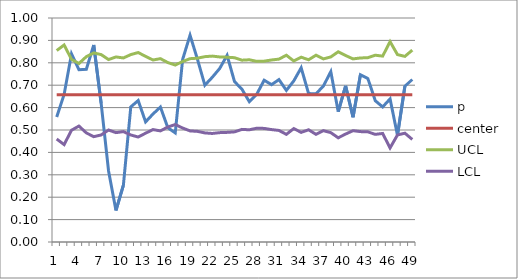
| Category | p | center | UCL | LCL |
|---|---|---|---|---|
| 0 | 0.558 | 0.657 | 0.855 | 0.46 |
| 1 | 0.659 | 0.657 | 0.88 | 0.435 |
| 2 | 0.84 | 0.657 | 0.815 | 0.499 |
| 3 | 0.769 | 0.657 | 0.797 | 0.518 |
| 4 | 0.771 | 0.657 | 0.827 | 0.487 |
| 5 | 0.879 | 0.657 | 0.844 | 0.47 |
| 6 | 0.619 | 0.657 | 0.837 | 0.478 |
| 7 | 0.317 | 0.657 | 0.814 | 0.5 |
| 8 | 0.141 | 0.657 | 0.826 | 0.488 |
| 9 | 0.253 | 0.657 | 0.822 | 0.493 |
| 10 | 0.603 | 0.657 | 0.837 | 0.478 |
| 11 | 0.632 | 0.657 | 0.846 | 0.469 |
| 12 | 0.536 | 0.657 | 0.829 | 0.486 |
| 13 | 0.571 | 0.657 | 0.813 | 0.502 |
| 14 | 0.603 | 0.657 | 0.818 | 0.496 |
| 15 | 0.51 | 0.657 | 0.801 | 0.513 |
| 16 | 0.487 | 0.657 | 0.79 | 0.524 |
| 17 | 0.815 | 0.657 | 0.806 | 0.509 |
| 18 | 0.923 | 0.657 | 0.818 | 0.496 |
| 19 | 0.816 | 0.657 | 0.821 | 0.494 |
| 20 | 0.7 | 0.657 | 0.827 | 0.487 |
| 21 | 0.735 | 0.657 | 0.83 | 0.485 |
| 22 | 0.775 | 0.657 | 0.826 | 0.488 |
| 23 | 0.833 | 0.657 | 0.825 | 0.489 |
| 24 | 0.716 | 0.657 | 0.823 | 0.492 |
| 25 | 0.682 | 0.657 | 0.812 | 0.503 |
| 26 | 0.627 | 0.657 | 0.814 | 0.501 |
| 27 | 0.659 | 0.657 | 0.806 | 0.508 |
| 28 | 0.722 | 0.657 | 0.807 | 0.507 |
| 29 | 0.702 | 0.657 | 0.813 | 0.502 |
| 30 | 0.725 | 0.657 | 0.816 | 0.498 |
| 31 | 0.677 | 0.657 | 0.834 | 0.481 |
| 32 | 0.719 | 0.657 | 0.808 | 0.506 |
| 33 | 0.778 | 0.657 | 0.825 | 0.489 |
| 34 | 0.663 | 0.657 | 0.814 | 0.501 |
| 35 | 0.662 | 0.657 | 0.834 | 0.481 |
| 36 | 0.696 | 0.657 | 0.817 | 0.497 |
| 37 | 0.761 | 0.657 | 0.826 | 0.488 |
| 38 | 0.582 | 0.657 | 0.849 | 0.465 |
| 39 | 0.697 | 0.657 | 0.832 | 0.482 |
| 40 | 0.557 | 0.657 | 0.817 | 0.497 |
| 41 | 0.747 | 0.657 | 0.822 | 0.493 |
| 42 | 0.73 | 0.657 | 0.823 | 0.492 |
| 43 | 0.631 | 0.657 | 0.834 | 0.481 |
| 44 | 0.603 | 0.657 | 0.83 | 0.485 |
| 45 | 0.639 | 0.657 | 0.895 | 0.42 |
| 46 | 0.476 | 0.657 | 0.837 | 0.478 |
| 47 | 0.696 | 0.657 | 0.829 | 0.486 |
| 48 | 0.725 | 0.657 | 0.857 | 0.458 |